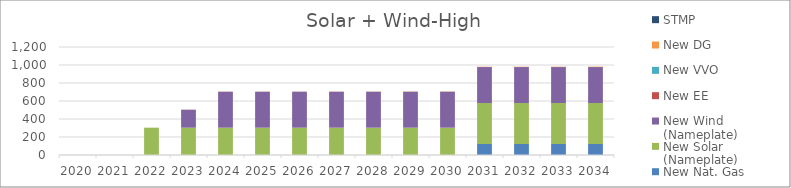
| Category | New Nat. Gas | New Solar (Nameplate) | New Wind (Nameplate) | New EE | New VVO | New DG | STMP |
|---|---|---|---|---|---|---|---|
| 2020.0 | 0 | 0 | 0 | 0 | 0 | 0 | 0 |
| 2021.0 | 0 | 0 | 0 | 0 | 0 | 0 | 0 |
| 2022.0 | 0 | 303.593 | 0 | 0 | 0 | 0 | 0 |
| 2023.0 | 0 | 303.593 | 200 | 0 | 0 | 1.022 | 0 |
| 2024.0 | 0 | 303.593 | 400 | 0 | 0 | 1.533 | 0 |
| 2025.0 | 0 | 303.593 | 400 | 0 | 0 | 1.533 | 0 |
| 2026.0 | 0 | 303.593 | 400 | 0 | 0 | 1.533 | 0 |
| 2027.0 | 0 | 303.593 | 400 | 0 | 0 | 2.044 | 0 |
| 2028.0 | 0 | 303.593 | 400 | 0 | 0 | 2.044 | 0 |
| 2029.0 | 0 | 303.593 | 400 | 0 | 0 | 2.555 | 0 |
| 2030.0 | 0 | 303.593 | 400 | 0 | 0 | 3.066 | 0 |
| 2031.0 | 122 | 455.389 | 400 | 0 | 0 | 3.577 | 0 |
| 2032.0 | 122 | 455.389 | 400 | 0 | 0 | 3.577 | 0 |
| 2033.0 | 122 | 455.389 | 400 | 0 | 0 | 4.088 | 0 |
| 2034.0 | 122 | 455.389 | 400 | 0 | 0 | 4.599 | 0 |